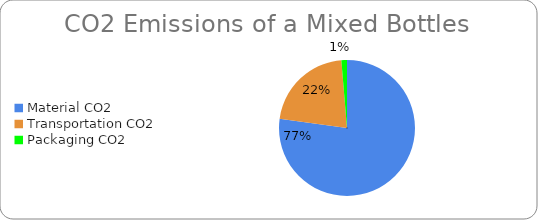
| Category | Series 0 |
|---|---|
| Material CO2 | 0.184 |
| Transportation CO2 | 0.051 |
| Packaging CO2 | 0.003 |